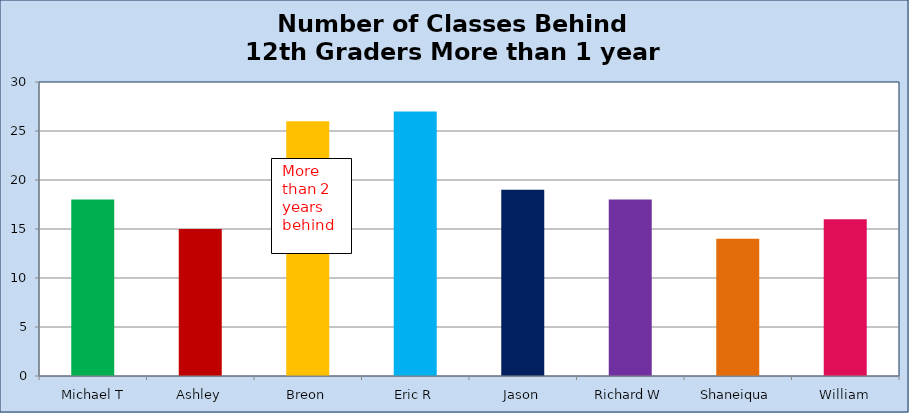
| Category | Number of Classes Behind |
|---|---|
|  Michael T | 18 |
| Ashley | 15 |
| Breon | 26 |
| Eric R | 27 |
| Jason | 19 |
| Richard W | 18 |
| Shaneiqua | 14 |
| William | 16 |